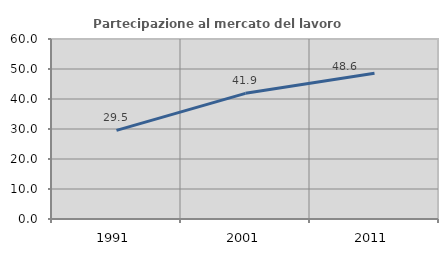
| Category | Partecipazione al mercato del lavoro  femminile |
|---|---|
| 1991.0 | 29.534 |
| 2001.0 | 41.883 |
| 2011.0 | 48.595 |